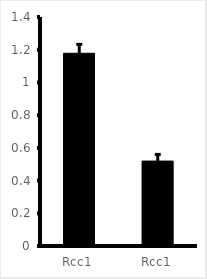
| Category | Series 0 |
|---|---|
| Rcc1 | 1.178 |
| Rcc1 | 0.519 |